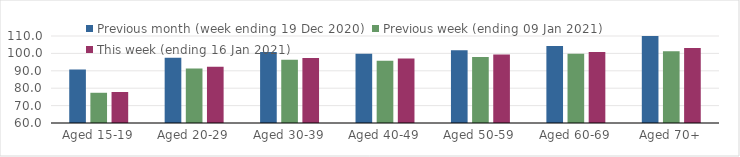
| Category | Previous month (week ending 19 Dec 2020) | Previous week (ending 09 Jan 2021) | This week (ending 16 Jan 2021) |
|---|---|---|---|
| Aged 15-19 | 90.71 | 77.37 | 77.81 |
| Aged 20-29 | 97.48 | 91.32 | 92.35 |
| Aged 30-39 | 100.76 | 96.29 | 97.35 |
| Aged 40-49 | 99.8 | 95.78 | 97.04 |
| Aged 50-59 | 101.82 | 97.99 | 99.32 |
| Aged 60-69 | 104.22 | 99.85 | 100.77 |
| Aged 70+ | 109.94 | 101.29 | 103.08 |